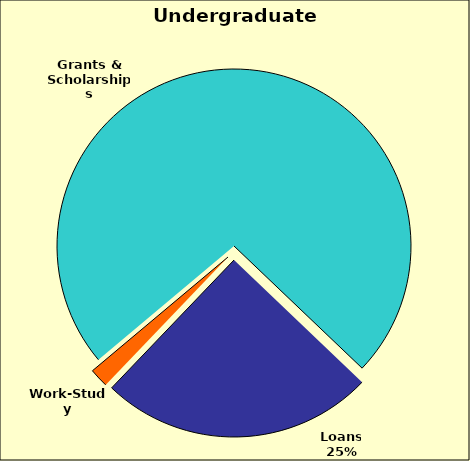
| Category | Series 0 |
|---|---|
| Grants & Scholarships | 0.732 |
| Loans | 0.25 |
| Work-Study | 0.017 |